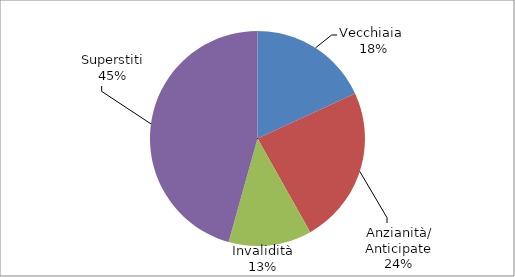
| Category | Series 0 |
|---|---|
| Vecchiaia  | 12745 |
| Anzianità/ Anticipate | 16701 |
| Invalidità | 8799 |
| Superstiti | 32147 |